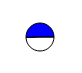
| Category | Series 0 |
|---|---|
| 0 | 5315471 |
| 1 | 5421285 |